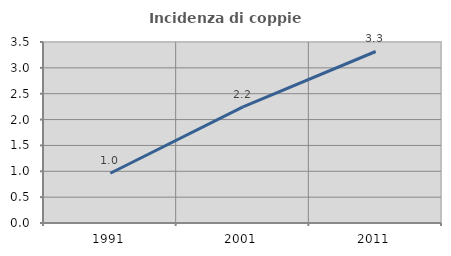
| Category | Incidenza di coppie miste |
|---|---|
| 1991.0 | 0.962 |
| 2001.0 | 2.244 |
| 2011.0 | 3.316 |